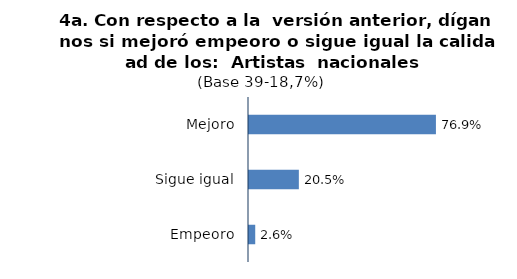
| Category | Series 0 |
|---|---|
| Mejoro | 0.769 |
| Sigue igual | 0.205 |
| Empeoro | 0.026 |